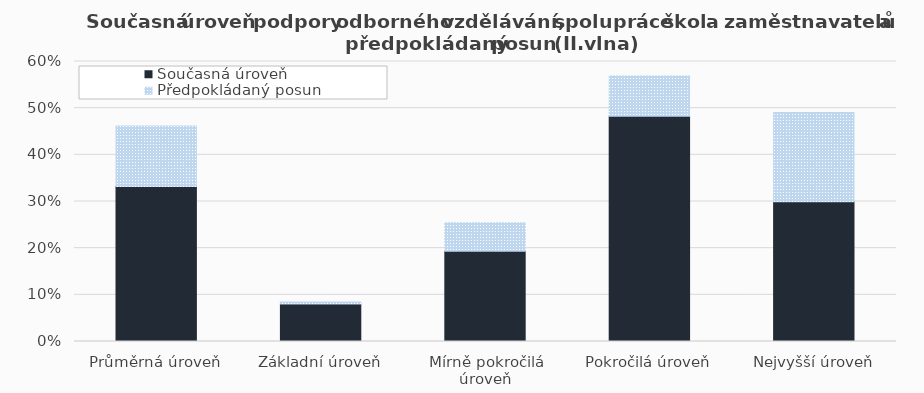
| Category | Současná úroveň | Předpokládaný posun |
|---|---|---|
| Průměrná úroveň | 0.332 | 0.13 |
| Základní úroveň | 0.08 | 0.005 |
| Mírně pokročilá úroveň | 0.193 | 0.061 |
| Pokročilá úroveň | 0.482 | 0.086 |
| Nejvyšší úroveň | 0.3 | 0.191 |